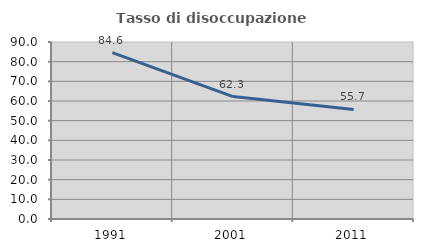
| Category | Tasso di disoccupazione giovanile  |
|---|---|
| 1991.0 | 84.586 |
| 2001.0 | 62.264 |
| 2011.0 | 55.696 |